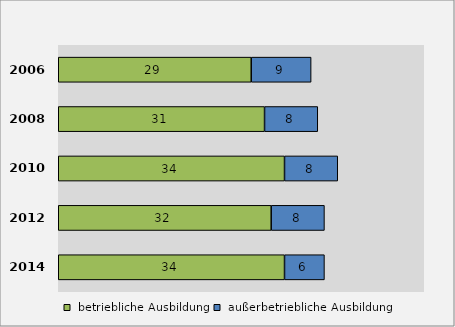
| Category |  betriebliche Ausbildung |  außerbetriebliche Ausbildung |
|---|---|---|
| 2014.0 | 34 | 6 |
| 2012.0 | 32 | 8 |
| 2010.0 | 34 | 8 |
| 2008.0 | 31 | 8 |
| 2006.0 | 29 | 9 |